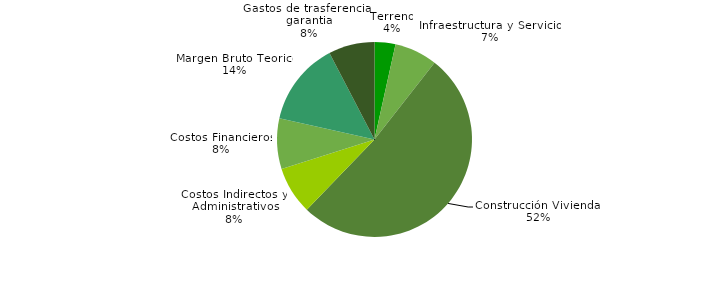
| Category | Series 0 |
|---|---|
| Terreno | 0.035 |
| Infraestructura y Servicios | 0.071 |
| Construcción Viviendas | 0.517 |
| Costos Indirectos y  Administrativos | 0.079 |
| Costos Financieros | 0.084 |
| Margen Bruto Teorico | 0.139 |
| Gastos de trasferencia y garantia | 0.076 |